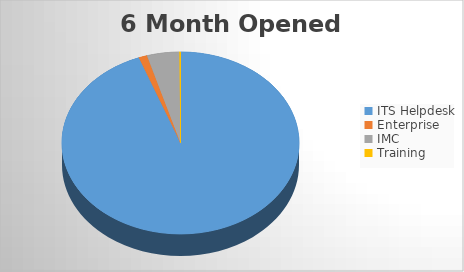
| Category | 6M Opened |
|---|---|
| ITS Helpdesk | 2209 |
| Enterprise | 27 |
| IMC | 103 |
| Training | 4 |